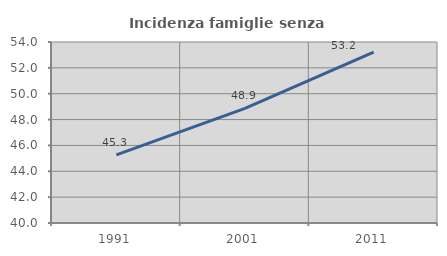
| Category | Incidenza famiglie senza nuclei |
|---|---|
| 1991.0 | 45.272 |
| 2001.0 | 48.864 |
| 2011.0 | 53.211 |